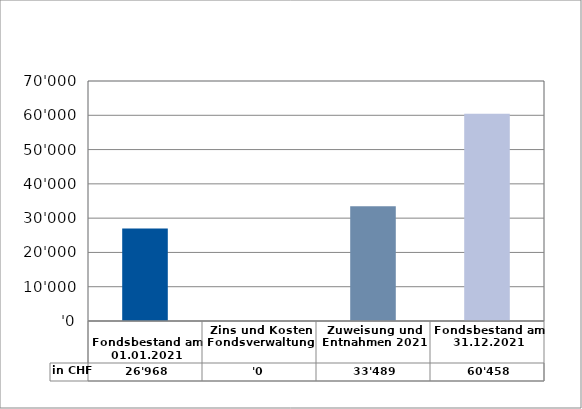
| Category | in CHF |
|---|---|
| 
Fondsbestand am 01.01.2021

 | 26968.41 |
| Zins und Kosten Fondsverwaltung | 0 |
| Zuweisung und Entnahmen 2021 | 33489.2 |
| Fondsbestand am 31.12.2021 | 60457.61 |